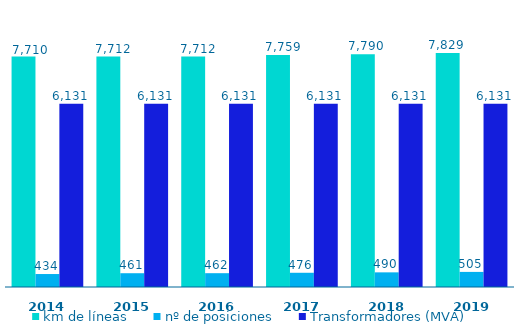
| Category | km de líneas | nº de posiciones | Transformadores (MVA) |
|---|---|---|---|
| 2014.0 | 7710.158 | 434 | 6131 |
| 2015.0 | 7711.569 | 461 | 6131 |
| 2016.0 | 7711.569 | 462 | 6131 |
| 2017.0 | 7759.128 | 476 | 6131 |
| 2018.0 | 7789.603 | 490 | 6131 |
| 2019.0 | 7829.005 | 505 | 6131 |